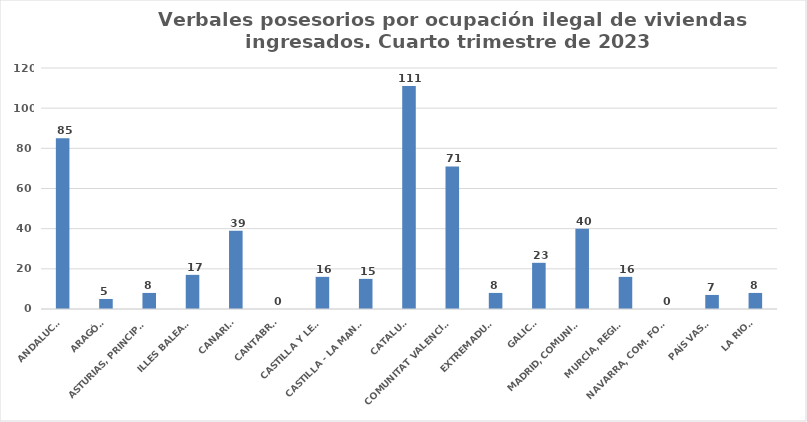
| Category | Series 0 |
|---|---|
| ANDALUCÍA | 85 |
| ARAGÓN | 5 |
| ASTURIAS, PRINCIPADO | 8 |
| ILLES BALEARS | 17 |
| CANARIAS | 39 |
| CANTABRIA | 0 |
| CASTILLA Y LEÓN | 16 |
| CASTILLA - LA MANCHA | 15 |
| CATALUÑA | 111 |
| COMUNITAT VALENCIANA | 71 |
| EXTREMADURA | 8 |
| GALICIA | 23 |
| MADRID, COMUNIDAD | 40 |
| MURCIA, REGIÓN | 16 |
| NAVARRA, COM. FORAL | 0 |
| PAÍS VASCO | 7 |
| LA RIOJA | 8 |